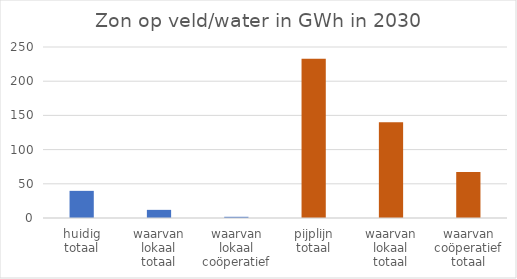
| Category | Zon op veld/water in GWh |
|---|---|
| huidig totaal | 39.68 |
| waarvan lokaal totaal | 11.9 |
| waarvan lokaal coöperatief | 1.75 |
| pijplijn totaal | 232.7 |
| waarvan lokaal totaal | 139.9 |
| waarvan coöperatief totaal | 67.25 |